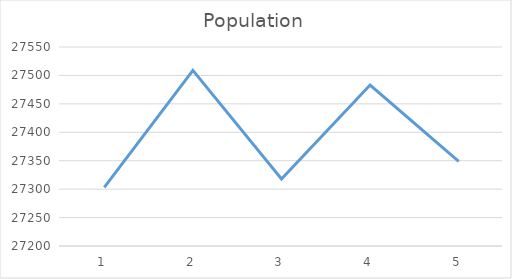
| Category | Series 0 |
|---|---|
| 0 | 27303 |
| 1 | 27509 |
| 2 | 27318 |
| 3 | 27483 |
| 4 | 27349 |